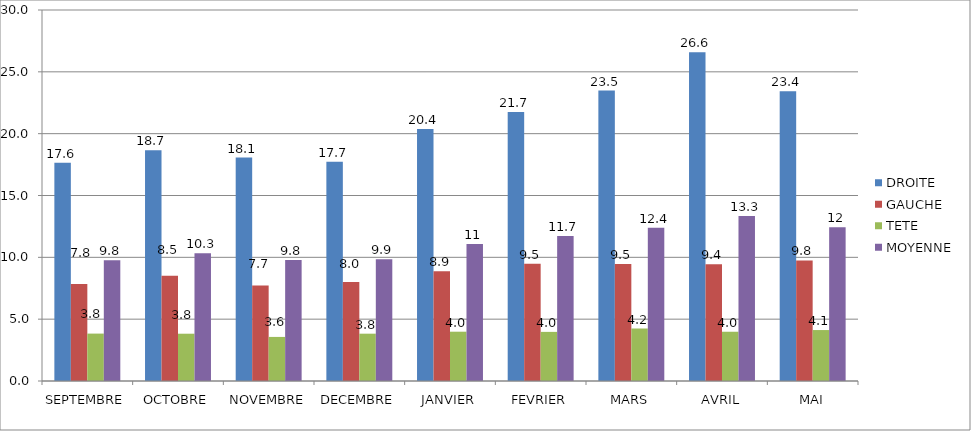
| Category | DROITE | GAUCHE | TETE | MOYENNE |
|---|---|---|---|---|
| SEPTEMBRE | 17.641 | 7.84 | 3.833 | 9.771 |
| OCTOBRE | 18.667 | 8.503 | 3.824 | 10.331 |
| NOVEMBRE | 18.065 | 7.718 | 3.565 | 9.782 |
| DECEMBRE | 17.735 | 8 | 3.827 | 9.854 |
| JANVIER | 20.367 | 8.878 | 3.986 | 11.077 |
| FEVRIER | 21.748 | 9.477 | 3.972 | 11.732 |
| MARS | 23.481 | 9.466 | 4.242 | 12.397 |
| AVRIL | 26.576 | 9.441 | 3.983 | 13.333 |
| MAI | 23.43 | 9.754 | 4.12 | 12.434 |